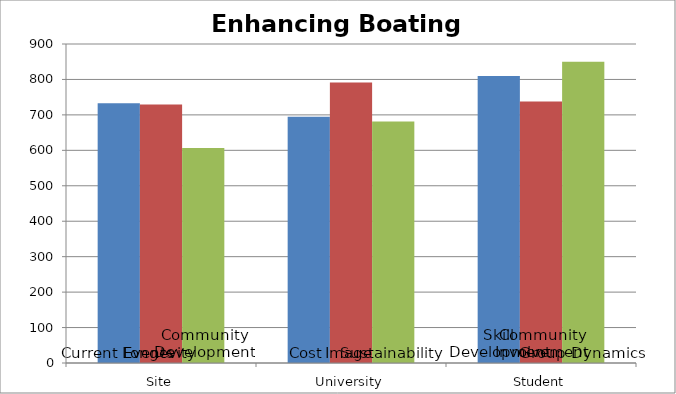
| Category | Alignment1 | Alignment2 | Alignment3 |
|---|---|---|---|
| 0 | 732.5 | 729 | 606.5 |
| 1 | 695 | 791.25 | 681.25 |
| 2 | 810 | 737.5 | 850 |